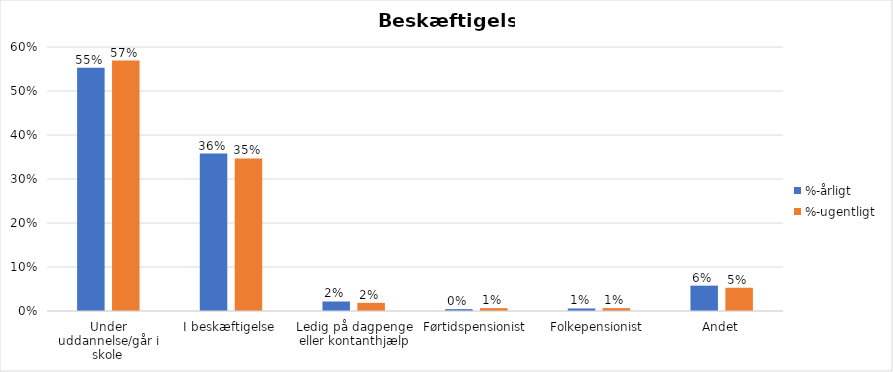
| Category | %-årligt | %-ugentligt |
|---|---|---|
| Under uddannelse/går i skole | 0.553 | 0.569 |
| I beskæftigelse | 0.358 | 0.347 |
| Ledig på dagpenge eller kontanthjælp | 0.022 | 0.019 |
| Førtidspensionist | 0.004 | 0.006 |
| Folkepensionist | 0.006 | 0.006 |
| Andet | 0.058 | 0.053 |